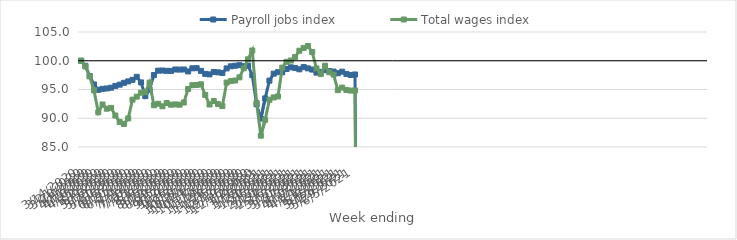
| Category | Payroll jobs index | Total wages index |
|---|---|---|
| 14/03/2020 | 100 | 100 |
| 21/03/2020 | 99.115 | 99.008 |
| 28/03/2020 | 97.351 | 97.268 |
| 04/04/2020 | 95.872 | 94.856 |
| 11/04/2020 | 94.938 | 91.038 |
| 18/04/2020 | 95.116 | 92.392 |
| 25/04/2020 | 95.182 | 91.659 |
| 02/05/2020 | 95.312 | 91.803 |
| 09/05/2020 | 95.622 | 90.477 |
| 16/05/2020 | 95.84 | 89.347 |
| 23/05/2020 | 96.162 | 89.003 |
| 30/05/2020 | 96.411 | 89.97 |
| 06/06/2020 | 96.683 | 93.232 |
| 13/06/2020 | 97.206 | 93.757 |
| 20/06/2020 | 96.234 | 94.443 |
| 27/06/2020 | 93.846 | 94.524 |
| 04/07/2020 | 94.994 | 96.206 |
| 11/07/2020 | 97.508 | 92.26 |
| 18/07/2020 | 98.278 | 92.519 |
| 25/07/2020 | 98.298 | 92.078 |
| 01/08/2020 | 98.245 | 92.654 |
| 08/08/2020 | 98.235 | 92.358 |
| 15/08/2020 | 98.48 | 92.403 |
| 22/08/2020 | 98.462 | 92.356 |
| 29/08/2020 | 98.483 | 92.742 |
| 05/09/2020 | 98.143 | 95.081 |
| 12/09/2020 | 98.684 | 95.754 |
| 19/09/2020 | 98.71 | 95.791 |
| 26/09/2020 | 98.24 | 95.907 |
| 03/10/2020 | 97.725 | 94.059 |
| 10/10/2020 | 97.628 | 92.393 |
| 17/10/2020 | 98.049 | 93 |
| 24/10/2020 | 97.979 | 92.462 |
| 31/10/2020 | 97.883 | 92.116 |
| 07/11/2020 | 98.667 | 96.207 |
| 14/11/2020 | 99.039 | 96.464 |
| 21/11/2020 | 99.136 | 96.56 |
| 28/11/2020 | 99.228 | 97.111 |
| 05/12/2020 | 99.058 | 98.68 |
| 12/12/2020 | 99.145 | 100.254 |
| 19/12/2020 | 97.496 | 101.781 |
| 26/12/2020 | 92.426 | 92.669 |
| 02/01/2021 | 89.953 | 86.972 |
| 09/01/2021 | 93.453 | 89.723 |
| 16/01/2021 | 96.54 | 93.219 |
| 23/01/2021 | 97.757 | 93.623 |
| 30/01/2021 | 98.012 | 93.79 |
| 06/02/2021 | 97.992 | 98.797 |
| 13/02/2021 | 98.56 | 99.815 |
| 20/02/2021 | 98.86 | 100.04 |
| 27/02/2021 | 98.746 | 100.656 |
| 06/03/2021 | 98.51 | 101.742 |
| 13/03/2021 | 98.902 | 102.232 |
| 20/03/2021 | 98.675 | 102.551 |
| 27/03/2021 | 98.462 | 101.517 |
| 03/04/2021 | 97.935 | 98.665 |
| 10/04/2021 | 98.064 | 97.686 |
| 17/04/2021 | 98.364 | 99.13 |
| 24/04/2021 | 98.219 | 97.986 |
| 01/05/2021 | 98.121 | 97.594 |
| 08/05/2021 | 97.824 | 94.89 |
| 15/05/2021 | 98.102 | 95.334 |
| 22/05/2021 | 97.705 | 94.917 |
| 29/05/2021 | 97.533 | 94.813 |
| 05/06/2021 | 97.616 | 94.833 |